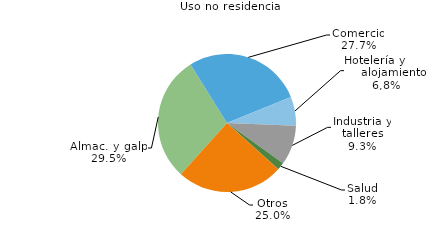
| Category | Series 0 |
|---|---|
| Almac. y galp. | 4522 |
| Comercio | 4247.07 |
| Hotelería y alojamiento | 1040 |
| Industria y talleres | 1428 |
| Salud | 267 |
| Otros | 3836.41 |